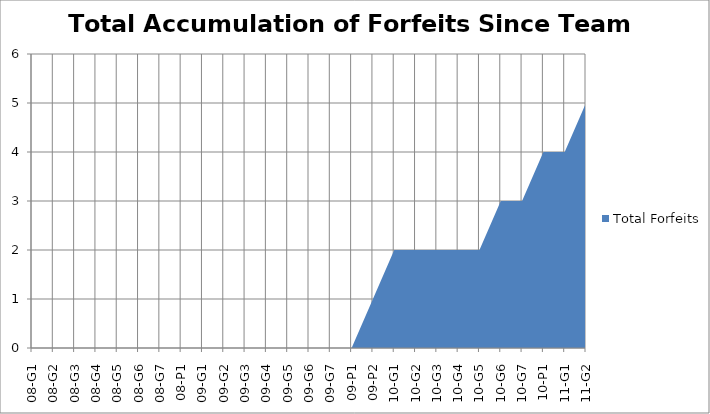
| Category | Total Forfeits |
|---|---|
| 08-G1 | 0 |
| 08-G2 | 0 |
| 08-G3 | 0 |
| 08-G4 | 0 |
| 08-G5 | 0 |
| 08-G6 | 0 |
| 08-G7 | 0 |
| 08-P1 | 0 |
| 09-G1 | 0 |
| 09-G2 | 0 |
| 09-G3 | 0 |
| 09-G4 | 0 |
| 09-G5 | 0 |
| 09-G6 | 0 |
| 09-G7 | 0 |
| 09-P1 | 0 |
| 09-P2 | 1 |
| 10-G1 | 2 |
| 10-G2 | 2 |
| 10-G3 | 2 |
| 10-G4 | 2 |
| 10-G5 | 2 |
| 10-G6 | 3 |
| 10-G7 | 3 |
| 10-P1 | 4 |
| 11-G1 | 4 |
| 11-G2 | 5 |